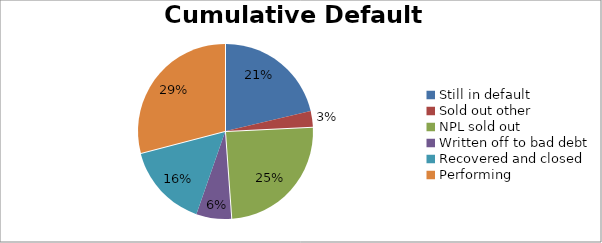
| Category | Cumulative Default Breakdown |
|---|---|
| Still in default | 0.213 |
| Sold out other | 0.029 |
| NPL sold out | 0.246 |
| Written off to bad debt | 0.065 |
| Recovered and closed | 0.156 |
| Performing | 0.291 |